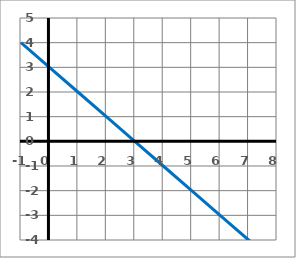
| Category | y |
|---|---|
| -1.0 | 4 |
| 0.0 | 3 |
| 1.0 | 2 |
| 2.0 | 1 |
| 3.0 | 0 |
| 4.0 | -1 |
| 5.0 | -2 |
| 6.0 | -3 |
| 7.0 | -4 |
| 8.0 | -5 |